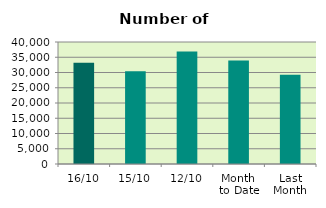
| Category | Series 0 |
|---|---|
| 16/10 | 33214 |
| 15/10 | 30384 |
| 12/10 | 36892 |
| Month 
to Date | 33923.667 |
| Last
Month | 29250.6 |